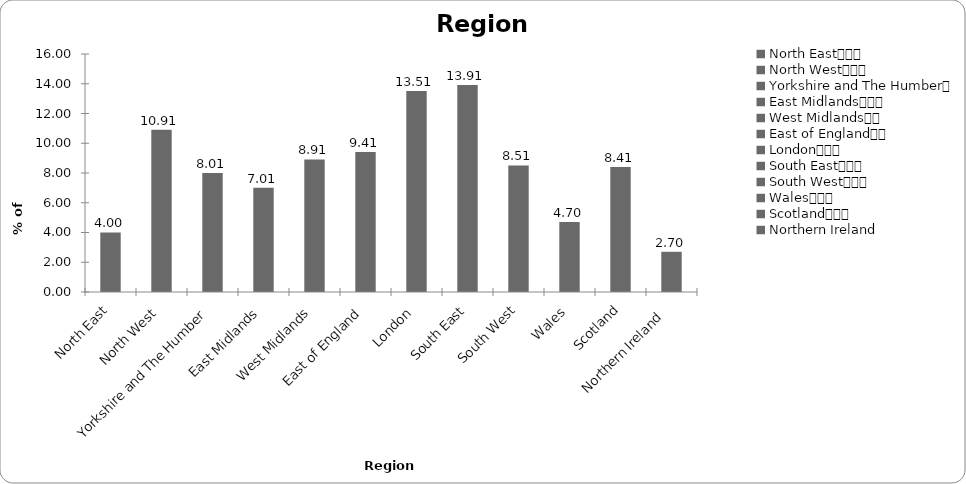
| Category | Region |
|---|---|
| North East			 | 4.004 |
| North West			 | 10.911 |
| Yorkshire and The Humber	 | 8.008 |
| East Midlands			 | 7.007 |
| West Midlands		 | 8.909 |
| East of England		 | 9.409 |
| London			 | 13.514 |
| South East			 | 13.914 |
| South West			 | 8.509 |
| Wales			 | 4.705 |
| Scotland			 | 8.408 |
| Northern Ireland  | 2.703 |